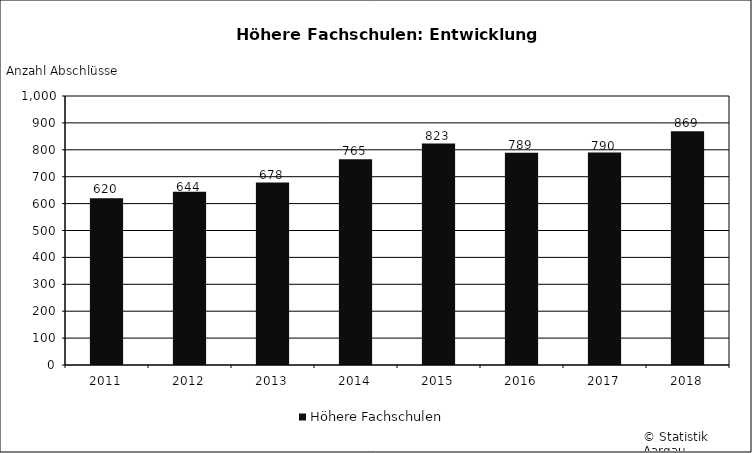
| Category | Höhere Fachschulen |
|---|---|
| 2011 | 620 |
| 2012 | 644 |
| 2013 | 678 |
| 2014 | 765 |
| 2015 | 823 |
| 2016 | 789 |
| 2017 | 790 |
| 2018 | 869 |